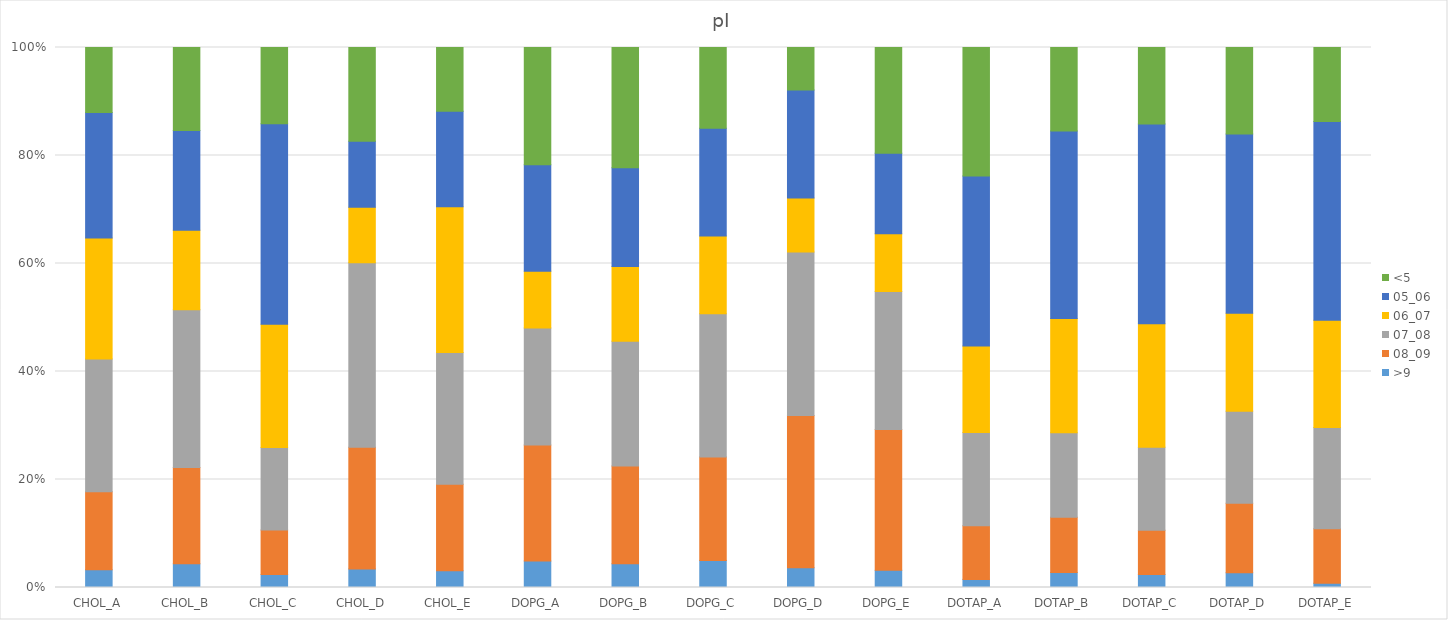
| Category | >9 | 08_09 | 07_08 | 06_07 | 05_06 | <5 |
|---|---|---|---|---|---|---|
| CHOL_A | 0.033 | 0.144 | 0.246 | 0.224 | 0.232 | 0.121 |
| CHOL_B | 0.044 | 0.178 | 0.292 | 0.147 | 0.185 | 0.154 |
| CHOL_C | 0.024 | 0.082 | 0.153 | 0.228 | 0.371 | 0.141 |
| CHOL_D | 0.034 | 0.225 | 0.341 | 0.103 | 0.122 | 0.173 |
| CHOL_E | 0.031 | 0.16 | 0.244 | 0.27 | 0.176 | 0.118 |
| DOPG_A | 0.049 | 0.215 | 0.217 | 0.105 | 0.197 | 0.217 |
| DOPG_B | 0.044 | 0.181 | 0.231 | 0.138 | 0.183 | 0.223 |
| DOPG_C | 0.05 | 0.192 | 0.265 | 0.144 | 0.2 | 0.149 |
| DOPG_D | 0.037 | 0.282 | 0.302 | 0.1 | 0.2 | 0.079 |
| DOPG_E | 0.032 | 0.261 | 0.256 | 0.107 | 0.149 | 0.196 |
| DOTAP_A | 0.015 | 0.099 | 0.173 | 0.16 | 0.315 | 0.238 |
| DOTAP_B | 0.028 | 0.102 | 0.157 | 0.211 | 0.347 | 0.154 |
| DOTAP_C | 0.024 | 0.082 | 0.154 | 0.228 | 0.37 | 0.142 |
| DOTAP_D | 0.027 | 0.129 | 0.17 | 0.182 | 0.332 | 0.16 |
| DOTAP_E | 0.008 | 0.101 | 0.188 | 0.199 | 0.368 | 0.137 |